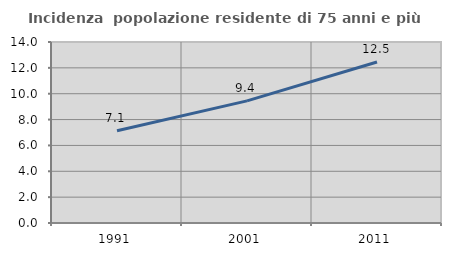
| Category | Incidenza  popolazione residente di 75 anni e più |
|---|---|
| 1991.0 | 7.138 |
| 2001.0 | 9.447 |
| 2011.0 | 12.456 |